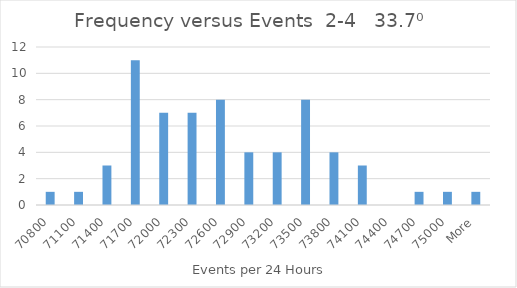
| Category | Frequency |
|---|---|
| 70800 | 1 |
| 71100 | 1 |
| 71400 | 3 |
| 71700 | 11 |
| 72000 | 7 |
| 72300 | 7 |
| 72600 | 8 |
| 72900 | 4 |
| 73200 | 4 |
| 73500 | 8 |
| 73800 | 4 |
| 74100 | 3 |
| 74400 | 0 |
| 74700 | 1 |
| 75000 | 1 |
| More | 1 |